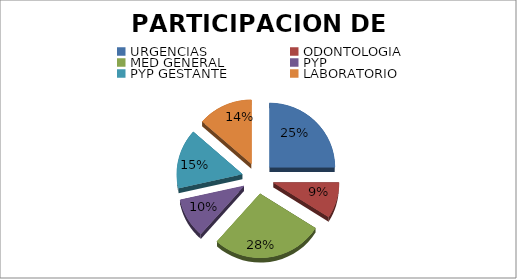
| Category | Series 0 | Series 1 |
|---|---|---|
| URGENCIAS | 50 | 0.25 |
| ODONTOLOGIA | 18 | 0.09 |
| MED GENERAL | 55 | 0.275 |
| PYP  | 20 | 0.1 |
| PYP GESTANTE | 30 | 0.15 |
| LABORATORIO | 27 | 0.135 |